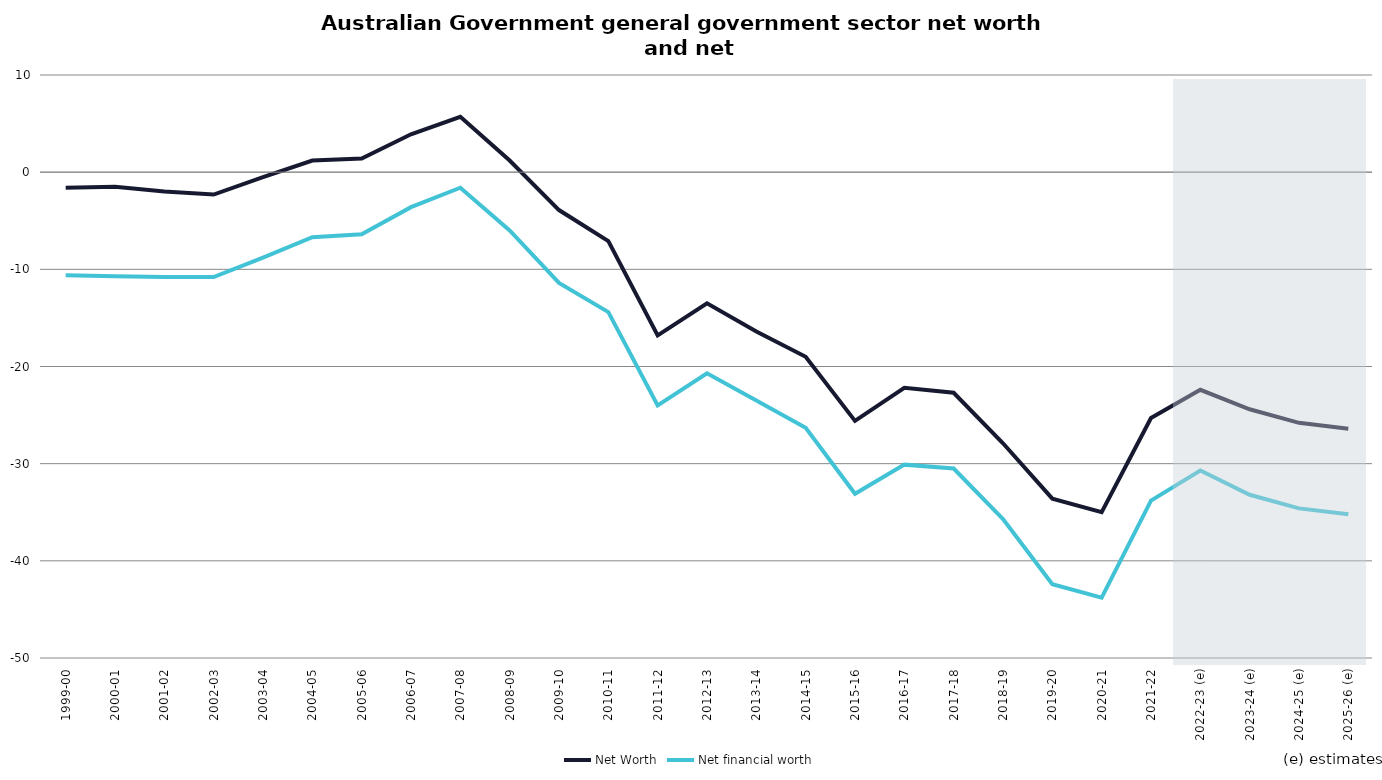
| Category | Net Worth | Net financial worth |
|---|---|---|
| 1999-00 | -1.6 | -10.6 |
| 2000-01 | -1.5 | -10.7 |
| 2001-02 | -2 | -10.8 |
| 2002-03 | -2.3 | -10.8 |
| 2003-04 | -0.5 | -8.8 |
| 2004-05 | 1.2 | -6.7 |
| 2005-06 | 1.4 | -6.4 |
| 2006-07 | 3.9 | -3.6 |
| 2007-08 | 5.7 | -1.6 |
| 2008-09 | 1.2 | -6 |
| 2009-10 | -3.9 | -11.4 |
| 2010-11 | -7.1 | -14.4 |
| 2011-12 | -16.8 | -24 |
| 2012-13 | -13.5 | -20.7 |
| 2013-14 | -16.4 | -23.5 |
| 2014-15 | -19 | -26.3 |
| 2015-16 | -25.6 | -33.1 |
| 2016-17 | -22.2 | -30.1 |
| 2017-18 | -22.7 | -30.5 |
| 2018-19 | -27.9 | -35.7 |
| 2019-20 | -33.6 | -42.4 |
| 2020-21 | -35 | -43.8 |
| 2021-22 | -25.3 | -33.8 |
| 2022-23 (e) | -22.4 | -30.7 |
| 2023-24 (e) | -24.4 | -33.2 |
| 2024-25 (e) | -25.8 | -34.6 |
| 2025-26 (e) | -26.4 | -35.2 |